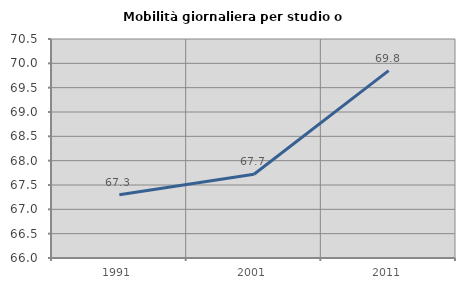
| Category | Mobilità giornaliera per studio o lavoro |
|---|---|
| 1991.0 | 67.299 |
| 2001.0 | 67.721 |
| 2011.0 | 69.849 |